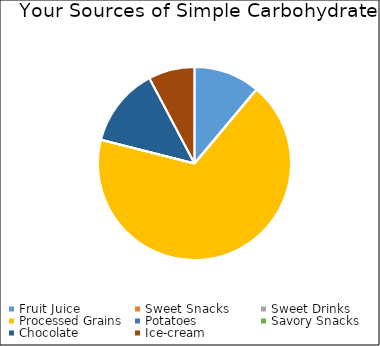
| Category | Series 0 |
|---|---|
| Fruit Juice | 25 |
| Sweet Snacks | 0 |
| Sweet Drinks | 0 |
| Processed Grains | 153 |
| Potatoes | 0 |
| Savory Snacks | 0 |
| Chocolate | 30 |
| Ice-cream | 17.5 |